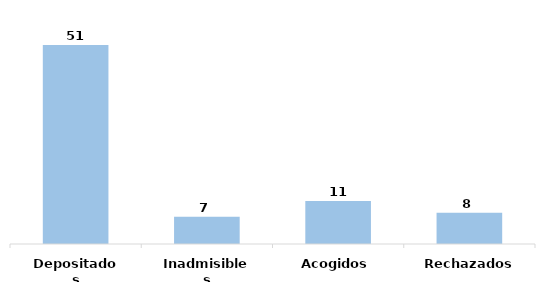
| Category | Series 0 |
|---|---|
| Depositados | 51 |
| Inadmisibles | 7 |
| Acogidos | 11 |
| Rechazados | 8 |